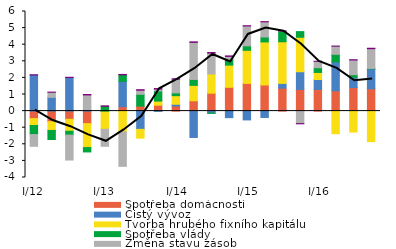
| Category | Spotřeba domácností  | Čistý vývoz  | Tvorba hrubého fixního kapitálu | Spotřeba vlády | Změna stavu zásob  | Výdaje neziskových institucí |
|---|---|---|---|---|---|---|
| I/12 | -0.454 | 2.174 | -0.415 | -0.545 | -0.706 | 0.011 |
| II | -0.638 | 0.829 | -0.527 | -0.547 | 0.309 | 0.003 |
| III | -0.496 | 2.028 | -0.718 | -0.234 | -1.502 | 0.008 |
| IV | -0.753 | 0.058 | -1.445 | -0.262 | 0.915 | 0.027 |
| I/13 | -0.014 | -0.015 | -1.069 | 0.29 | -1.024 | 0.024 |
| II | 0.263 | 1.526 | -1.245 | 0.396 | -2.082 | 0.025 |
| III | 0.301 | -1.1 | -0.531 | 0.711 | 0.246 | 0.03 |
|  IV | 0.358 | -0.016 | 0.244 | 0.613 | 0.112 | 0.029 |
|  I/14 | 0.304 | 0.109 | 0.516 | 0.168 | 0.826 | 0.024 |
| II | 0.621 | -1.588 | 0.93 | 0.355 | 2.234 | 0.03 |
| III | 1.078 | -0.118 | 1.161 | -0.016 | 1.26 | 0.029 |
| IV | 1.432 | -0.394 | 1.338 | 0.351 | 0.174 | 0.029 |
|  I/15 | 1.67 | -0.531 | 1.992 | 0.271 | 1.196 | 0.011 |
| II | 1.573 | -0.383 | 2.595 | 0.294 | 0.915 | 0.01 |
| III | 1.384 | 0.284 | 2.508 | 0.629 | 0.018 | 0.002 |
| IV | 1.306 | 1.065 | 2.077 | 0.34 | -0.756 | -0.008 |
|  I/16 | 1.304 | 0.6 | 0.424 | 0.288 | 0.384 | 0 |
| II | 1.223 | 1.738 | -1.361 | 0.459 | 0.491 | 0.003 |
| III | 1.417 | 0.621 | -1.264 | 0.158 | 0.883 | 0.015 |
| IV | 1.343 | 1.198 | -1.839 | 0.029 | 1.19 | 0.027 |